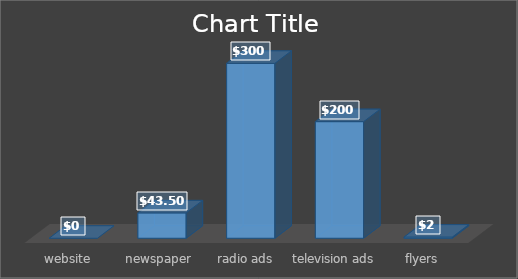
| Category | Series 0 |
|---|---|
| website | 0 |
| newspaper ads | 43.5 |
| radio ads | 300 |
| television ads | 200 |
| flyers | 2 |